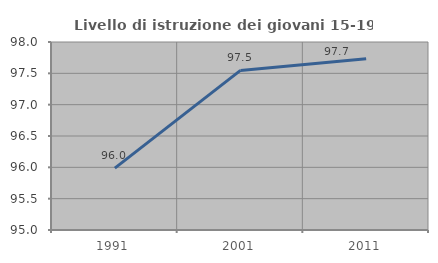
| Category | Livello di istruzione dei giovani 15-19 anni |
|---|---|
| 1991.0 | 95.988 |
| 2001.0 | 97.547 |
| 2011.0 | 97.732 |